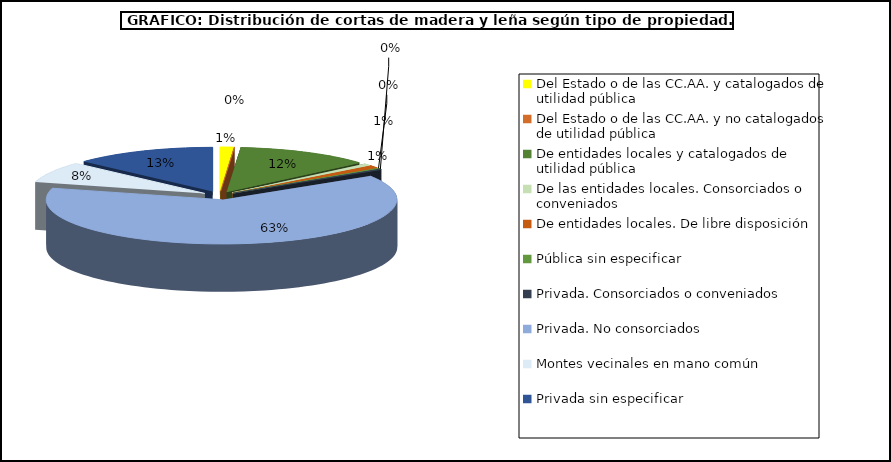
| Category | Series 0 |
|---|---|
| Del Estado o de las CC.AA. y catalogados de utilidad pública | 205227.52 |
| Del Estado o de las CC.AA. y no catalogados de utilidad pública | 7797.57 |
| De entidades locales y catalogados de utilidad pública | 2081900.16 |
| De las entidades locales. Consorciados o conveniados | 130079.35 |
| De entidades locales. De libre disposición | 173513.41 |
| Pública sin especificar | 45097.06 |
| Privada. Consorciados o conveniados | 50392.08 |
| Privada. No consorciados | 10647016.67 |
| Montes vecinales en mano común | 1295792.75 |
| Privada sin especificar | 2211000.48 |